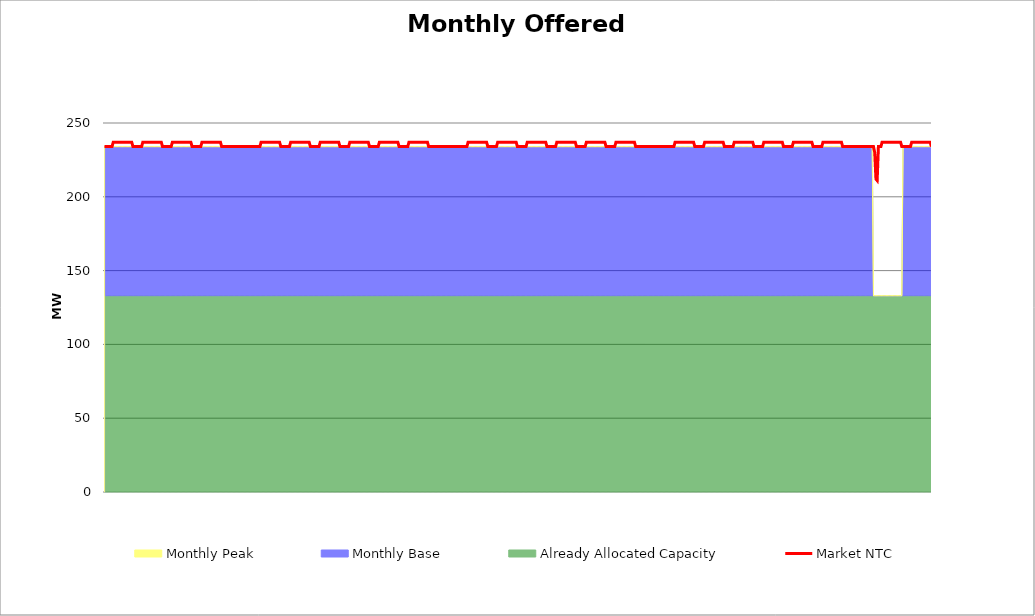
| Category | Market NTC |
|---|---|
| 0 | 234 |
| 1 | 234 |
| 2 | 234 |
| 3 | 234 |
| 4 | 234 |
| 5 | 234 |
| 6 | 234 |
| 7 | 237 |
| 8 | 237 |
| 9 | 237 |
| 10 | 237 |
| 11 | 237 |
| 12 | 237 |
| 13 | 237 |
| 14 | 237 |
| 15 | 237 |
| 16 | 237 |
| 17 | 237 |
| 18 | 237 |
| 19 | 237 |
| 20 | 237 |
| 21 | 237 |
| 22 | 237 |
| 23 | 234 |
| 24 | 234 |
| 25 | 234 |
| 26 | 234 |
| 27 | 234 |
| 28 | 234 |
| 29 | 234 |
| 30 | 234 |
| 31 | 237 |
| 32 | 237 |
| 33 | 237 |
| 34 | 237 |
| 35 | 237 |
| 36 | 237 |
| 37 | 237 |
| 38 | 237 |
| 39 | 237 |
| 40 | 237 |
| 41 | 237 |
| 42 | 237 |
| 43 | 237 |
| 44 | 237 |
| 45 | 237 |
| 46 | 237 |
| 47 | 234 |
| 48 | 234 |
| 49 | 234 |
| 50 | 234 |
| 51 | 234 |
| 52 | 234 |
| 53 | 234 |
| 54 | 234 |
| 55 | 237 |
| 56 | 237 |
| 57 | 237 |
| 58 | 237 |
| 59 | 237 |
| 60 | 237 |
| 61 | 237 |
| 62 | 237 |
| 63 | 237 |
| 64 | 237 |
| 65 | 237 |
| 66 | 237 |
| 67 | 237 |
| 68 | 237 |
| 69 | 237 |
| 70 | 237 |
| 71 | 234 |
| 72 | 234 |
| 73 | 234 |
| 74 | 234 |
| 75 | 234 |
| 76 | 234 |
| 77 | 234 |
| 78 | 234 |
| 79 | 237 |
| 80 | 237 |
| 81 | 237 |
| 82 | 237 |
| 83 | 237 |
| 84 | 237 |
| 85 | 237 |
| 86 | 237 |
| 87 | 237 |
| 88 | 237 |
| 89 | 237 |
| 90 | 237 |
| 91 | 237 |
| 92 | 237 |
| 93 | 237 |
| 94 | 237 |
| 95 | 234 |
| 96 | 234 |
| 97 | 234 |
| 98 | 234 |
| 99 | 234 |
| 100 | 234 |
| 101 | 234 |
| 102 | 234 |
| 103 | 234 |
| 104 | 234 |
| 105 | 234 |
| 106 | 234 |
| 107 | 234 |
| 108 | 234 |
| 109 | 234 |
| 110 | 234 |
| 111 | 234 |
| 112 | 234 |
| 113 | 234 |
| 114 | 234 |
| 115 | 234 |
| 116 | 234 |
| 117 | 234 |
| 118 | 234 |
| 119 | 234 |
| 120 | 234 |
| 121 | 234 |
| 122 | 234 |
| 123 | 234 |
| 124 | 234 |
| 125 | 234 |
| 126 | 234 |
| 127 | 237 |
| 128 | 237 |
| 129 | 237 |
| 130 | 237 |
| 131 | 237 |
| 132 | 237 |
| 133 | 237 |
| 134 | 237 |
| 135 | 237 |
| 136 | 237 |
| 137 | 237 |
| 138 | 237 |
| 139 | 237 |
| 140 | 237 |
| 141 | 237 |
| 142 | 237 |
| 143 | 234 |
| 144 | 234 |
| 145 | 234 |
| 146 | 234 |
| 147 | 234 |
| 148 | 234 |
| 149 | 234 |
| 150 | 234 |
| 151 | 237 |
| 152 | 237 |
| 153 | 237 |
| 154 | 237 |
| 155 | 237 |
| 156 | 237 |
| 157 | 237 |
| 158 | 237 |
| 159 | 237 |
| 160 | 237 |
| 161 | 237 |
| 162 | 237 |
| 163 | 237 |
| 164 | 237 |
| 165 | 237 |
| 166 | 237 |
| 167 | 234 |
| 168 | 234 |
| 169 | 234 |
| 170 | 234 |
| 171 | 234 |
| 172 | 234 |
| 173 | 234 |
| 174 | 234 |
| 175 | 237 |
| 176 | 237 |
| 177 | 237 |
| 178 | 237 |
| 179 | 237 |
| 180 | 237 |
| 181 | 237 |
| 182 | 237 |
| 183 | 237 |
| 184 | 237 |
| 185 | 237 |
| 186 | 237 |
| 187 | 237 |
| 188 | 237 |
| 189 | 237 |
| 190 | 237 |
| 191 | 234 |
| 192 | 234 |
| 193 | 234 |
| 194 | 234 |
| 195 | 234 |
| 196 | 234 |
| 197 | 234 |
| 198 | 234 |
| 199 | 237 |
| 200 | 237 |
| 201 | 237 |
| 202 | 237 |
| 203 | 237 |
| 204 | 237 |
| 205 | 237 |
| 206 | 237 |
| 207 | 237 |
| 208 | 237 |
| 209 | 237 |
| 210 | 237 |
| 211 | 237 |
| 212 | 237 |
| 213 | 237 |
| 214 | 237 |
| 215 | 234 |
| 216 | 234 |
| 217 | 234 |
| 218 | 234 |
| 219 | 234 |
| 220 | 234 |
| 221 | 234 |
| 222 | 234 |
| 223 | 237 |
| 224 | 237 |
| 225 | 237 |
| 226 | 237 |
| 227 | 237 |
| 228 | 237 |
| 229 | 237 |
| 230 | 237 |
| 231 | 237 |
| 232 | 237 |
| 233 | 237 |
| 234 | 237 |
| 235 | 237 |
| 236 | 237 |
| 237 | 237 |
| 238 | 237 |
| 239 | 234 |
| 240 | 234 |
| 241 | 234 |
| 242 | 234 |
| 243 | 234 |
| 244 | 234 |
| 245 | 234 |
| 246 | 234 |
| 247 | 237 |
| 248 | 237 |
| 249 | 237 |
| 250 | 237 |
| 251 | 237 |
| 252 | 237 |
| 253 | 237 |
| 254 | 237 |
| 255 | 237 |
| 256 | 237 |
| 257 | 237 |
| 258 | 237 |
| 259 | 237 |
| 260 | 237 |
| 261 | 237 |
| 262 | 237 |
| 263 | 234 |
| 264 | 234 |
| 265 | 234 |
| 266 | 234 |
| 267 | 234 |
| 268 | 234 |
| 269 | 234 |
| 270 | 234 |
| 271 | 234 |
| 272 | 234 |
| 273 | 234 |
| 274 | 234 |
| 275 | 234 |
| 276 | 234 |
| 277 | 234 |
| 278 | 234 |
| 279 | 234 |
| 280 | 234 |
| 281 | 234 |
| 282 | 234 |
| 283 | 234 |
| 284 | 234 |
| 285 | 234 |
| 286 | 234 |
| 287 | 234 |
| 288 | 234 |
| 289 | 234 |
| 290 | 234 |
| 291 | 234 |
| 292 | 234 |
| 293 | 234 |
| 294 | 234 |
| 295 | 237 |
| 296 | 237 |
| 297 | 237 |
| 298 | 237 |
| 299 | 237 |
| 300 | 237 |
| 301 | 237 |
| 302 | 237 |
| 303 | 237 |
| 304 | 237 |
| 305 | 237 |
| 306 | 237 |
| 307 | 237 |
| 308 | 237 |
| 309 | 237 |
| 310 | 237 |
| 311 | 234 |
| 312 | 234 |
| 313 | 234 |
| 314 | 234 |
| 315 | 234 |
| 316 | 234 |
| 317 | 234 |
| 318 | 234 |
| 319 | 237 |
| 320 | 237 |
| 321 | 237 |
| 322 | 237 |
| 323 | 237 |
| 324 | 237 |
| 325 | 237 |
| 326 | 237 |
| 327 | 237 |
| 328 | 237 |
| 329 | 237 |
| 330 | 237 |
| 331 | 237 |
| 332 | 237 |
| 333 | 237 |
| 334 | 237 |
| 335 | 234 |
| 336 | 234 |
| 337 | 234 |
| 338 | 234 |
| 339 | 234 |
| 340 | 234 |
| 341 | 234 |
| 342 | 234 |
| 343 | 237 |
| 344 | 237 |
| 345 | 237 |
| 346 | 237 |
| 347 | 237 |
| 348 | 237 |
| 349 | 237 |
| 350 | 237 |
| 351 | 237 |
| 352 | 237 |
| 353 | 237 |
| 354 | 237 |
| 355 | 237 |
| 356 | 237 |
| 357 | 237 |
| 358 | 237 |
| 359 | 234 |
| 360 | 234 |
| 361 | 234 |
| 362 | 234 |
| 363 | 234 |
| 364 | 234 |
| 365 | 234 |
| 366 | 234 |
| 367 | 237 |
| 368 | 237 |
| 369 | 237 |
| 370 | 237 |
| 371 | 237 |
| 372 | 237 |
| 373 | 237 |
| 374 | 237 |
| 375 | 237 |
| 376 | 237 |
| 377 | 237 |
| 378 | 237 |
| 379 | 237 |
| 380 | 237 |
| 381 | 237 |
| 382 | 237 |
| 383 | 234 |
| 384 | 234 |
| 385 | 234 |
| 386 | 234 |
| 387 | 234 |
| 388 | 234 |
| 389 | 234 |
| 390 | 234 |
| 391 | 237 |
| 392 | 237 |
| 393 | 237 |
| 394 | 237 |
| 395 | 237 |
| 396 | 237 |
| 397 | 237 |
| 398 | 237 |
| 399 | 237 |
| 400 | 237 |
| 401 | 237 |
| 402 | 237 |
| 403 | 237 |
| 404 | 237 |
| 405 | 237 |
| 406 | 237 |
| 407 | 234 |
| 408 | 234 |
| 409 | 234 |
| 410 | 234 |
| 411 | 234 |
| 412 | 234 |
| 413 | 234 |
| 414 | 234 |
| 415 | 237 |
| 416 | 237 |
| 417 | 237 |
| 418 | 237 |
| 419 | 237 |
| 420 | 237 |
| 421 | 237 |
| 422 | 237 |
| 423 | 237 |
| 424 | 237 |
| 425 | 237 |
| 426 | 237 |
| 427 | 237 |
| 428 | 237 |
| 429 | 237 |
| 430 | 237 |
| 431 | 234 |
| 432 | 234 |
| 433 | 234 |
| 434 | 234 |
| 435 | 234 |
| 436 | 234 |
| 437 | 234 |
| 438 | 234 |
| 439 | 234 |
| 440 | 234 |
| 441 | 234 |
| 442 | 234 |
| 443 | 234 |
| 444 | 234 |
| 445 | 234 |
| 446 | 234 |
| 447 | 234 |
| 448 | 234 |
| 449 | 234 |
| 450 | 234 |
| 451 | 234 |
| 452 | 234 |
| 453 | 234 |
| 454 | 234 |
| 455 | 234 |
| 456 | 234 |
| 457 | 234 |
| 458 | 234 |
| 459 | 234 |
| 460 | 234 |
| 461 | 234 |
| 462 | 234 |
| 463 | 237 |
| 464 | 237 |
| 465 | 237 |
| 466 | 237 |
| 467 | 237 |
| 468 | 237 |
| 469 | 237 |
| 470 | 237 |
| 471 | 237 |
| 472 | 237 |
| 473 | 237 |
| 474 | 237 |
| 475 | 237 |
| 476 | 237 |
| 477 | 237 |
| 478 | 237 |
| 479 | 234 |
| 480 | 234 |
| 481 | 234 |
| 482 | 234 |
| 483 | 234 |
| 484 | 234 |
| 485 | 234 |
| 486 | 234 |
| 487 | 237 |
| 488 | 237 |
| 489 | 237 |
| 490 | 237 |
| 491 | 237 |
| 492 | 237 |
| 493 | 237 |
| 494 | 237 |
| 495 | 237 |
| 496 | 237 |
| 497 | 237 |
| 498 | 237 |
| 499 | 237 |
| 500 | 237 |
| 501 | 237 |
| 502 | 237 |
| 503 | 234 |
| 504 | 234 |
| 505 | 234 |
| 506 | 234 |
| 507 | 234 |
| 508 | 234 |
| 509 | 234 |
| 510 | 234 |
| 511 | 237 |
| 512 | 237 |
| 513 | 237 |
| 514 | 237 |
| 515 | 237 |
| 516 | 237 |
| 517 | 237 |
| 518 | 237 |
| 519 | 237 |
| 520 | 237 |
| 521 | 237 |
| 522 | 237 |
| 523 | 237 |
| 524 | 237 |
| 525 | 237 |
| 526 | 237 |
| 527 | 234 |
| 528 | 234 |
| 529 | 234 |
| 530 | 234 |
| 531 | 234 |
| 532 | 234 |
| 533 | 234 |
| 534 | 234 |
| 535 | 237 |
| 536 | 237 |
| 537 | 237 |
| 538 | 237 |
| 539 | 237 |
| 540 | 237 |
| 541 | 237 |
| 542 | 237 |
| 543 | 237 |
| 544 | 237 |
| 545 | 237 |
| 546 | 237 |
| 547 | 237 |
| 548 | 237 |
| 549 | 237 |
| 550 | 237 |
| 551 | 234 |
| 552 | 234 |
| 553 | 234 |
| 554 | 234 |
| 555 | 234 |
| 556 | 234 |
| 557 | 234 |
| 558 | 234 |
| 559 | 237 |
| 560 | 237 |
| 561 | 237 |
| 562 | 237 |
| 563 | 237 |
| 564 | 237 |
| 565 | 237 |
| 566 | 237 |
| 567 | 237 |
| 568 | 237 |
| 569 | 237 |
| 570 | 237 |
| 571 | 237 |
| 572 | 237 |
| 573 | 237 |
| 574 | 237 |
| 575 | 234 |
| 576 | 234 |
| 577 | 234 |
| 578 | 234 |
| 579 | 234 |
| 580 | 234 |
| 581 | 234 |
| 582 | 234 |
| 583 | 237 |
| 584 | 237 |
| 585 | 237 |
| 586 | 237 |
| 587 | 237 |
| 588 | 237 |
| 589 | 237 |
| 590 | 237 |
| 591 | 237 |
| 592 | 237 |
| 593 | 237 |
| 594 | 237 |
| 595 | 237 |
| 596 | 237 |
| 597 | 237 |
| 598 | 237 |
| 599 | 234 |
| 600 | 234 |
| 601 | 234 |
| 602 | 234 |
| 603 | 234 |
| 604 | 234 |
| 605 | 234 |
| 606 | 234 |
| 607 | 234 |
| 608 | 234 |
| 609 | 234 |
| 610 | 234 |
| 611 | 234 |
| 612 | 234 |
| 613 | 234 |
| 614 | 234 |
| 615 | 234 |
| 616 | 234 |
| 617 | 234 |
| 618 | 234 |
| 619 | 234 |
| 620 | 234 |
| 621 | 234 |
| 622 | 234 |
| 623 | 234 |
| 624 | 234 |
| 625 | 230 |
| 626 | 212 |
| 627 | 211 |
| 628 | 234 |
| 629 | 234 |
| 630 | 234 |
| 631 | 237 |
| 632 | 237 |
| 633 | 237 |
| 634 | 237 |
| 635 | 237 |
| 636 | 237 |
| 637 | 237 |
| 638 | 237 |
| 639 | 237 |
| 640 | 237 |
| 641 | 237 |
| 642 | 237 |
| 643 | 237 |
| 644 | 237 |
| 645 | 237 |
| 646 | 237 |
| 647 | 234 |
| 648 | 234 |
| 649 | 234 |
| 650 | 234 |
| 651 | 234 |
| 652 | 234 |
| 653 | 234 |
| 654 | 234 |
| 655 | 237 |
| 656 | 237 |
| 657 | 237 |
| 658 | 237 |
| 659 | 237 |
| 660 | 237 |
| 661 | 237 |
| 662 | 237 |
| 663 | 237 |
| 664 | 237 |
| 665 | 237 |
| 666 | 237 |
| 667 | 237 |
| 668 | 237 |
| 669 | 237 |
| 670 | 237 |
| 671 | 234 |